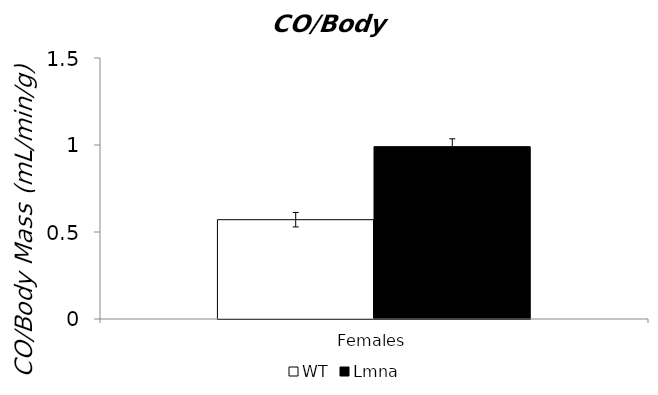
| Category | WT | Lmna |
|---|---|---|
| 0 | 0.571 | 0.991 |